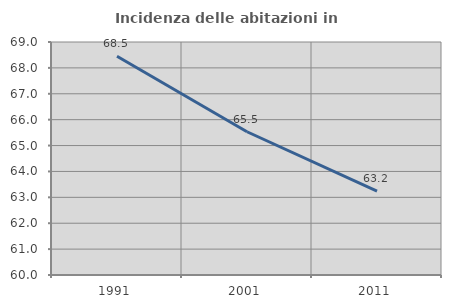
| Category | Incidenza delle abitazioni in proprietà  |
|---|---|
| 1991.0 | 68.452 |
| 2001.0 | 65.533 |
| 2011.0 | 63.244 |